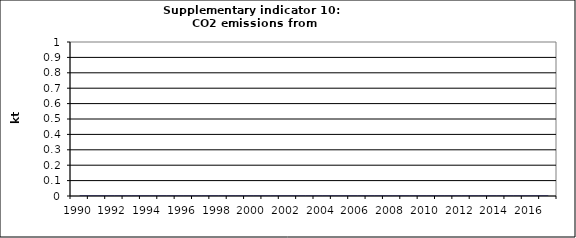
| Category | CO2 emissions from autoproducers, kt |
|---|---|
| 1990 | 0 |
| 1991 | 0 |
| 1992 | 0 |
| 1993 | 0 |
| 1994 | 0 |
| 1995 | 0 |
| 1996 | 0 |
| 1997 | 0 |
| 1998 | 0 |
| 1999 | 0 |
| 2000 | 0 |
| 2001 | 0 |
| 2002 | 0 |
| 2003 | 0 |
| 2004 | 0 |
| 2005 | 0 |
| 2006 | 0 |
| 2007 | 0 |
| 2008 | 0 |
| 2009 | 0 |
| 2010 | 0 |
| 2011 | 0 |
| 2012 | 0 |
| 2013 | 0 |
| 2014 | 0 |
| 2015 | 0 |
| 2016 | 0 |
| 2017 | 0 |